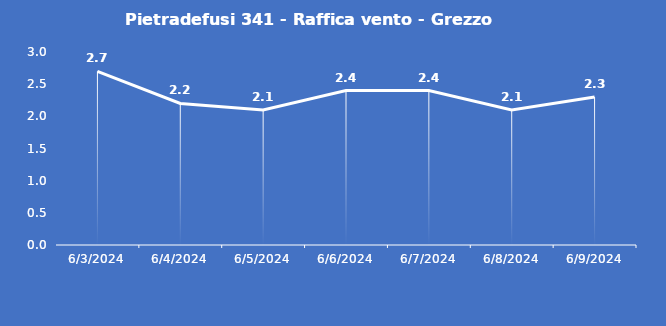
| Category | Pietradefusi 341 - Raffica vento - Grezzo (m/s) |
|---|---|
| 6/3/24 | 2.7 |
| 6/4/24 | 2.2 |
| 6/5/24 | 2.1 |
| 6/6/24 | 2.4 |
| 6/7/24 | 2.4 |
| 6/8/24 | 2.1 |
| 6/9/24 | 2.3 |